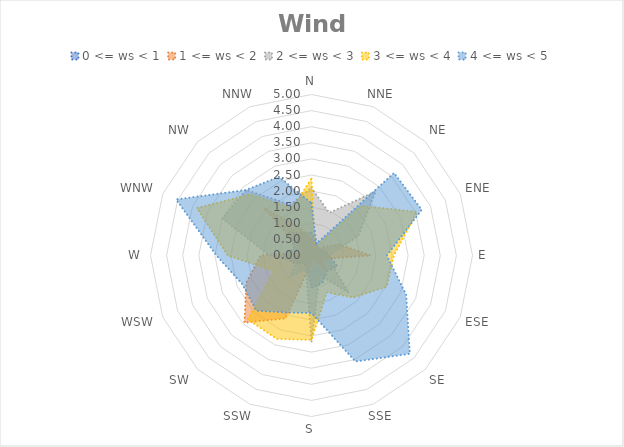
| Category | 0 <= ws < 1 | 1 <= ws < 2 | 2 <= ws < 3 | 3 <= ws < 4 | 4 <= ws < 5 |
|---|---|---|---|---|---|
| N | 0.711 | 0.483 | 2.105 | 2.385 | 1.626 |
| NNE | 0.412 | 0.402 | 1.433 | 0.281 | 0.396 |
| NE | 0.275 | 0.322 | 2.818 | 2.18 | 3.626 |
| ENE | 0.445 | 0.923 | 1.571 | 3.543 | 3.706 |
| E | 0.56 | 1.822 | 0.536 | 2.559 | 2.338 |
| ESE | 0.862 | 0.301 | 0.671 | 2.528 | 3.182 |
| SE | 0.686 | 0.693 | 1.642 | 1.844 | 4.319 |
| SSE | 0.909 | 0.08 | 0.649 | 1.237 | 3.563 |
| S | 0.994 | 0.22 | 2.695 | 2.622 | 1.785 |
| SSW | 0.4 | 2.115 | 0.455 | 2.807 | 1.92 |
| SW | 0.352 | 2.947 | 0.952 | 2.801 | 2.428 |
| WSW | 0.603 | 2.188 | 0.497 | 1.258 | 2.326 |
| W | 0.906 | 1.583 | 1.302 | 2.601 | 2.951 |
| WNW | 0.581 | 0.299 | 3 | 3.853 | 4.55 |
| NW | 1 | 2.073 | 2.881 | 2.678 | 2.877 |
| NNW | 0.77 | 0.938 | 1.708 | 1.589 | 2.645 |